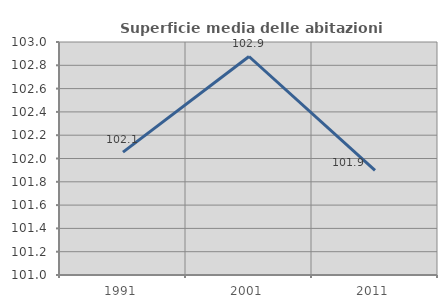
| Category | Superficie media delle abitazioni occupate |
|---|---|
| 1991.0 | 102.055 |
| 2001.0 | 102.876 |
| 2011.0 | 101.897 |